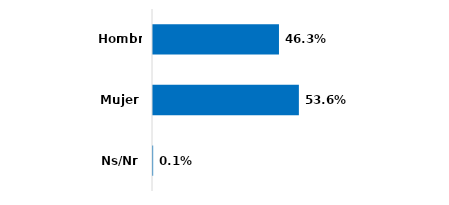
| Category | Series 0 |
|---|---|
| Hombre | 0.463 |
| Mujer | 0.536 |
| Ns/Nr | 0.001 |